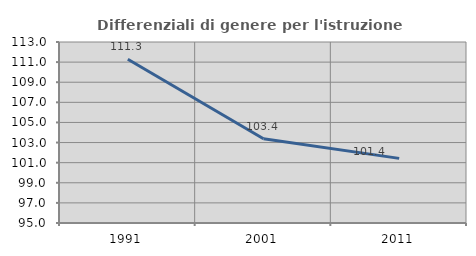
| Category | Differenziali di genere per l'istruzione superiore |
|---|---|
| 1991.0 | 111.283 |
| 2001.0 | 103.378 |
| 2011.0 | 101.426 |